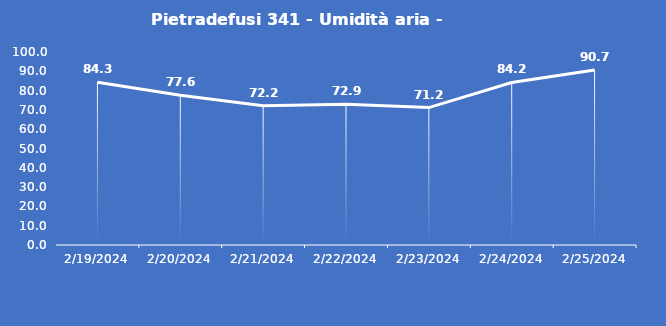
| Category | Pietradefusi 341 - Umidità aria - Grezzo (%) |
|---|---|
| 2/19/24 | 84.3 |
| 2/20/24 | 77.6 |
| 2/21/24 | 72.2 |
| 2/22/24 | 72.9 |
| 2/23/24 | 71.2 |
| 2/24/24 | 84.2 |
| 2/25/24 | 90.7 |